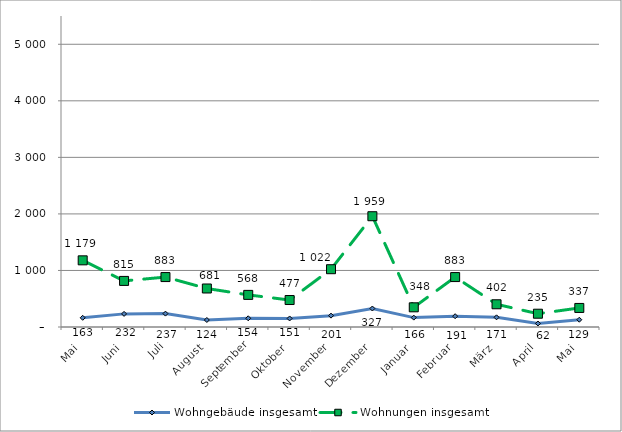
| Category | Wohngebäude insgesamt | Wohnungen insgesamt |
|---|---|---|
| Mai | 163 | 1179 |
| Juni | 232 | 815 |
| Juli | 237 | 883 |
| August | 124 | 681 |
| September | 154 | 568 |
| Oktober | 151 | 477 |
| November | 201 | 1022 |
| Dezember | 327 | 1959 |
| Januar | 166 | 348 |
| Februar | 191 | 883 |
| März | 171 | 402 |
| April | 62 | 235 |
| Mai | 129 | 337 |